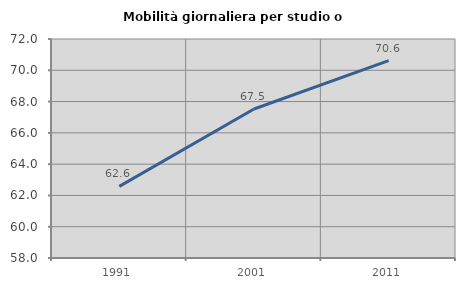
| Category | Mobilità giornaliera per studio o lavoro |
|---|---|
| 1991.0 | 62.581 |
| 2001.0 | 67.523 |
| 2011.0 | 70.615 |